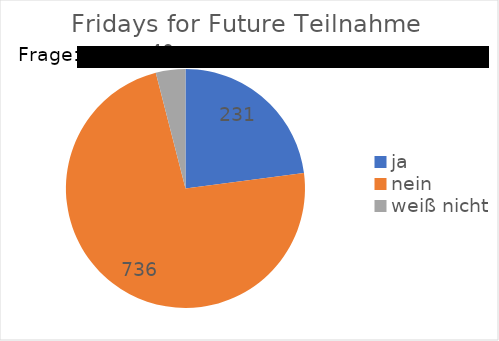
| Category | Fridays for Future Teilnahme |
|---|---|
| ja | 230.847 |
| nein | 736.157 |
| weiß nicht | 40.315 |